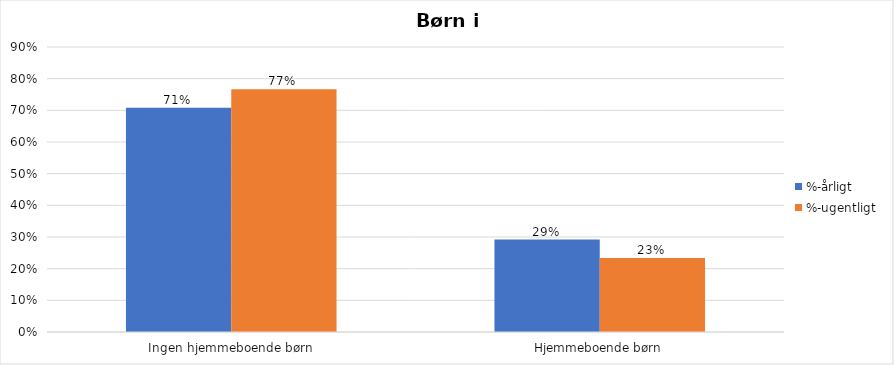
| Category | %-årligt | %-ugentligt |
|---|---|---|
| Ingen hjemmeboende børn | 0.708 | 0.766 |
| Hjemmeboende børn | 0.292 | 0.234 |